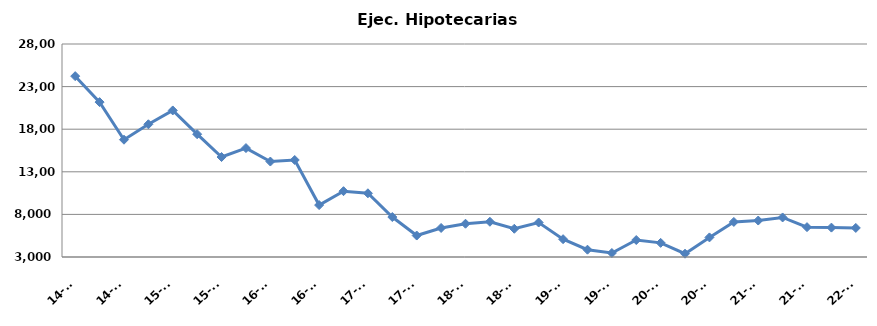
| Category | Ej. Hipotecarias |
|---|---|
| 14-T1 | 24226 |
| 14-T2 | 21178 |
| 14-T3 | 16767 |
| 14-T4 | 18578 |
| 15-T1 | 20201 |
| 15-T2 | 17414 |
| 15-T3 | 14735 |
| 15-T4 | 15785 |
| 16-T1 | 14205 |
| 16-T2 | 14385 |
| 16-T3 | 9094 |
| 16-T4 | 10726 |
| 17-T1 | 10478 |
| 17-T2 | 7689 |
| 17-T3 | 5518 |
| 17-T4 | 6409 |
| 18-T1 | 6903 |
| 18-T2 | 7137 |
| 18-T3 | 6315 |
| 18-T4 | 7049 |
| 19-T1 | 5092 |
| 19-T2 | 3857 |
| 19-T3 | 3470 |
| 19-T4 | 4992 |
| 20-T1 | 4658 |
| 20-T2 | 3387 |
| 20-T3 | 5299 |
| 20-T4 | 7116 |
| 21-T1 | 7280 |
| 21-T2 | 7641 |
| 21-T3 | 6504 |
| 21-T4 | 6449 |
| 22-T1 | 6410 |